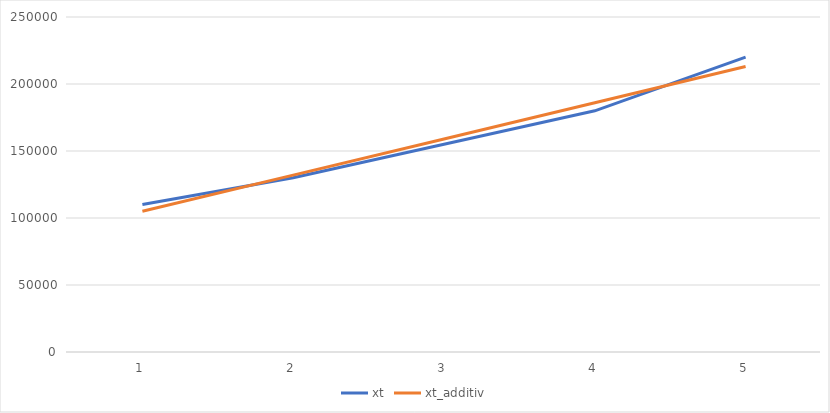
| Category | xt | xt_additiv |
|---|---|---|
| 0 | 110000 | 105000 |
| 1 | 130000 | 132000 |
| 2 | 155000 | 159000 |
| 3 | 180000 | 186000 |
| 4 | 220000 | 213000 |